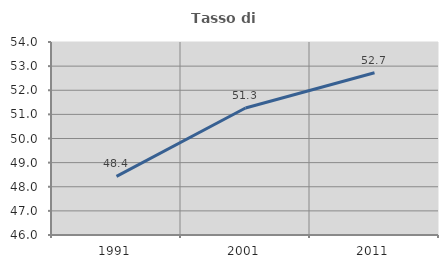
| Category | Tasso di occupazione   |
|---|---|
| 1991.0 | 48.432 |
| 2001.0 | 51.265 |
| 2011.0 | 52.724 |